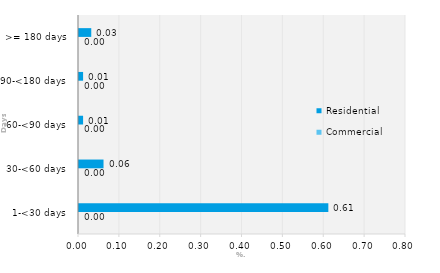
| Category | Commercial | Residential |
|---|---|---|
| 1-<30 days | 0 | 0.61 |
| 30-<60 days | 0 | 0.06 |
| 60-<90 days | 0 | 0.01 |
| 90-<180 days | 0 | 0.01 |
| >= 180 days | 0 | 0.03 |